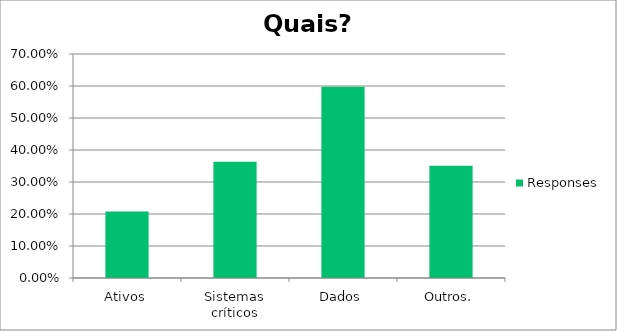
| Category | Responses |
|---|---|
| Ativos | 0.208 |
| Sistemas críticos | 0.364 |
| Dados | 0.597 |
| Outros. | 0.351 |